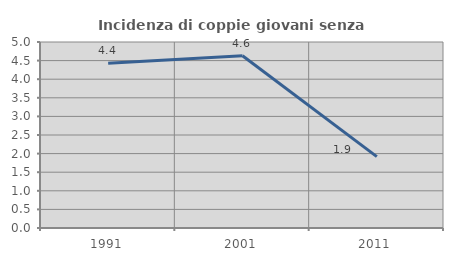
| Category | Incidenza di coppie giovani senza figli |
|---|---|
| 1991.0 | 4.429 |
| 2001.0 | 4.63 |
| 2011.0 | 1.92 |